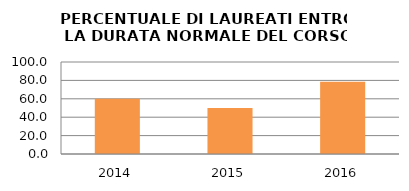
| Category | 2014 2015 2016 |
|---|---|
| 2014.0 | 60 |
| 2015.0 | 50 |
| 2016.0 | 78.571 |